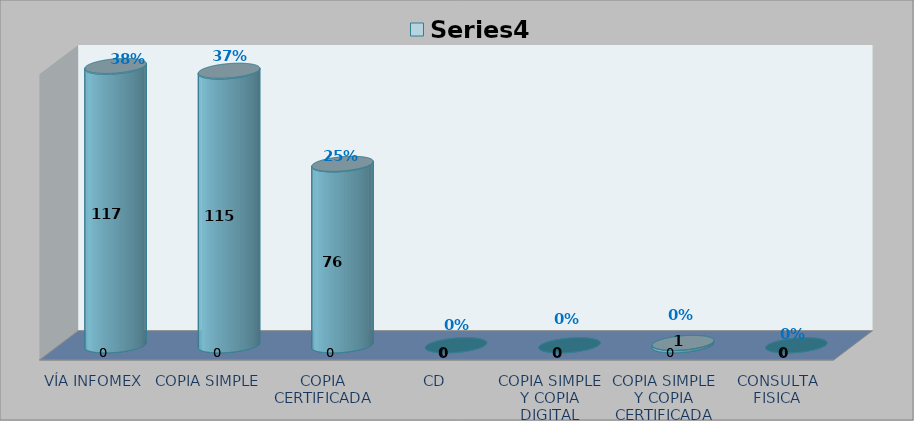
| Category |        FORMATO SOLICITADO | Series 1 | Series 2 | Series 3 |
|---|---|---|---|---|
| VÍA INFOMEX |  |  | 117 | 0.379 |
| COPIA SIMPLE |  |  | 115 | 0.372 |
| COPIA CERTIFICADA |  |  | 76 | 0.246 |
| CD |  |  | 0 | 0 |
| COPIA SIMPLE Y COPIA DIGITAL |  |  | 0 | 0 |
| COPIA SIMPLE Y COPIA CERTIFICADA |  |  | 1 | 0.003 |
| CONSULTA FISICA |  |  | 0 | 0 |